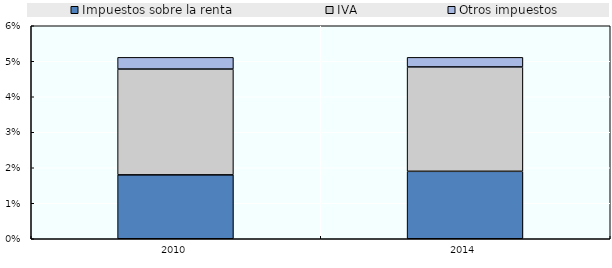
| Category | Impuestos sobre la renta | IVA | Otros impuestos |
|---|---|---|---|
| 2010.0 | 0.018 | 0.03 | 0.003 |
| 2014.0 | 0.019 | 0.029 | 0.003 |